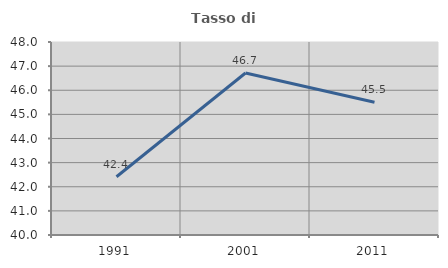
| Category | Tasso di occupazione   |
|---|---|
| 1991.0 | 42.414 |
| 2001.0 | 46.715 |
| 2011.0 | 45.501 |